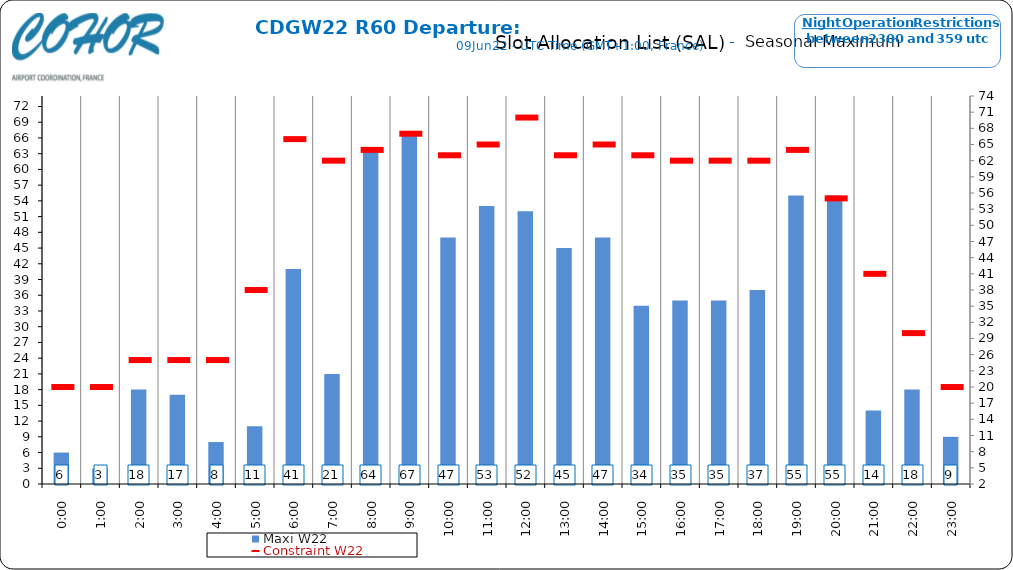
| Category | Maxi W22 |
|---|---|
| 0:00 | 6 |
| 1:00 | 3 |
| 2:00 | 18 |
| 3:00 | 17 |
| 4:00 | 8 |
| 5:00 | 11 |
| 6:00 | 41 |
| 7:00 | 21 |
| 8:00 | 64 |
| 9:00 | 67 |
| 10:00 | 47 |
| 11:00 | 53 |
| 12:00 | 52 |
| 13:00 | 45 |
| 14:00 | 47 |
| 15:00 | 34 |
| 16:00 | 35 |
| 17:00 | 35 |
| 18:00 | 37 |
| 19:00 | 55 |
| 20:00 | 55 |
| 21:00 | 14 |
| 22:00 | 18 |
| 23:00 | 9 |